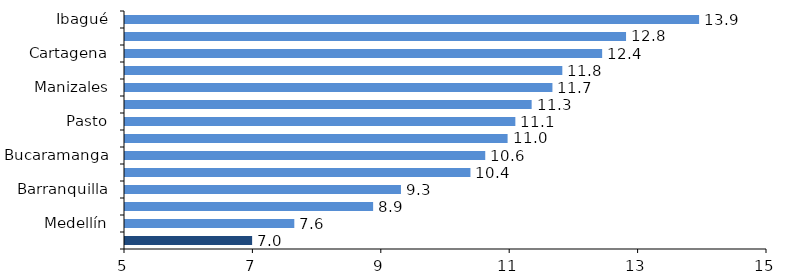
| Category | Series 0 |
|---|---|
| Ibagué | 13.943 |
| Cúcuta | 12.805 |
| Cartagena | 12.432 |
| Pereira | 11.812 |
| Manizales | 11.658 |
| Montería | 11.334 |
| Pasto | 11.08 |
| Villavicencio | 10.959 |
| Bucaramanga | 10.611 |
| Cali | 10.381 |
| Barranquilla | 9.298 |
| Total 13 áreas | 8.865 |
| Medellín | 7.637 |
| Bogotá | 6.98 |